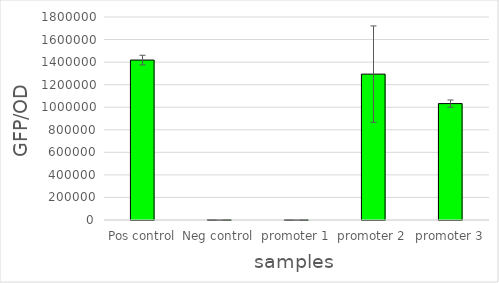
| Category | Series 0 |
|---|---|
| Pos control | 1418119.848 |
| Neg control | 2609.532 |
| promoter 1 | 2259.082 |
| promoter 2 | 1293456.605 |
| promoter 3 | 1032085.279 |